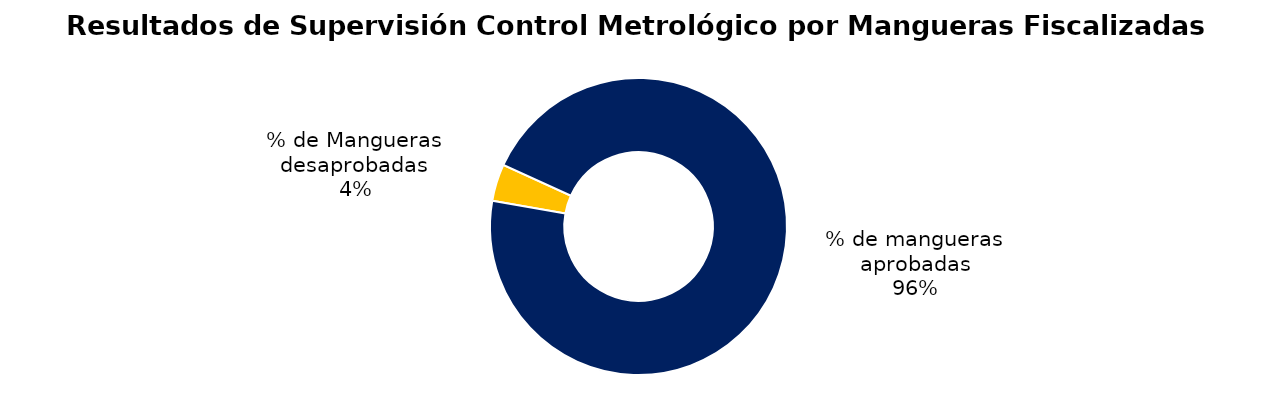
| Category | Series 0 |
|---|---|
| % de Mangueras desaprobadas | 39 |
| % de mangueras aprobadas | 930 |